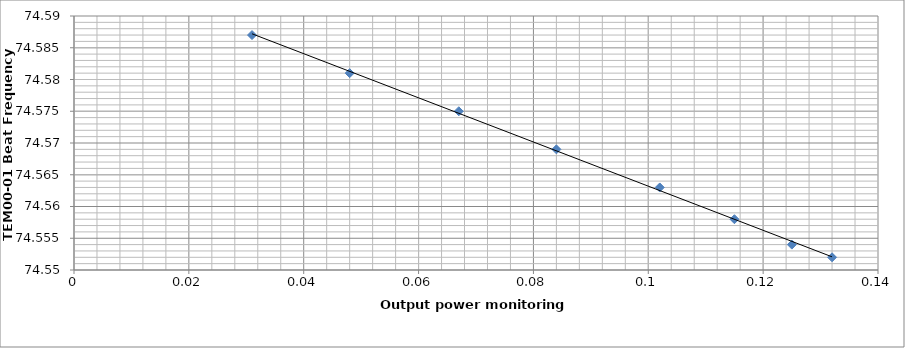
| Category | Series 0 |
|---|---|
| 0.132 | 74.552 |
| 0.125 | 74.554 |
| 0.115 | 74.558 |
| 0.102 | 74.563 |
| 0.084 | 74.569 |
| 0.067 | 74.575 |
| 0.048 | 74.581 |
| 0.031 | 74.587 |